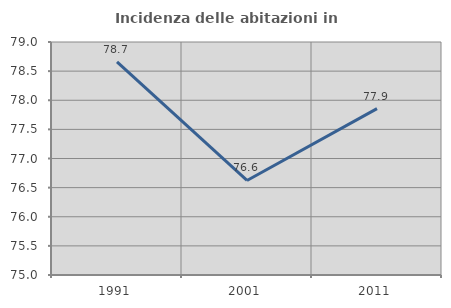
| Category | Incidenza delle abitazioni in proprietà  |
|---|---|
| 1991.0 | 78.659 |
| 2001.0 | 76.623 |
| 2011.0 | 77.857 |